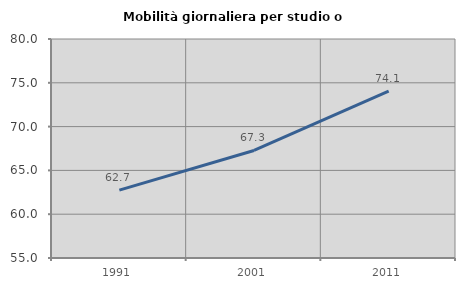
| Category | Mobilità giornaliera per studio o lavoro |
|---|---|
| 1991.0 | 62.749 |
| 2001.0 | 67.273 |
| 2011.0 | 74.051 |